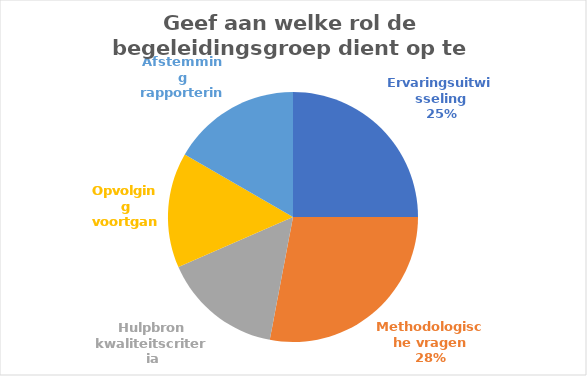
| Category | Votes |
|---|---|
| Ervaringsuitwisseling | 42 |
| Methodologische vragen | 47 |
| Hulpbron kwaliteitscriteria | 26 |
| Opvolging voortgang | 25 |
| Afstemming rapportering | 28 |